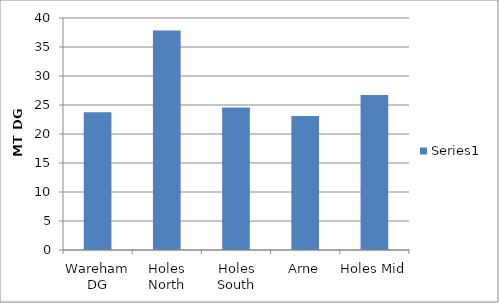
| Category | Series 0 |
|---|---|
| 
Wareham DG | 23.745 |
| _x000b_Holes North | 37.833 |
| _x000b_Holes South | 24.584 |
| _x0004_Arne | 23.091 |
| 	Holes Mid | 26.705 |